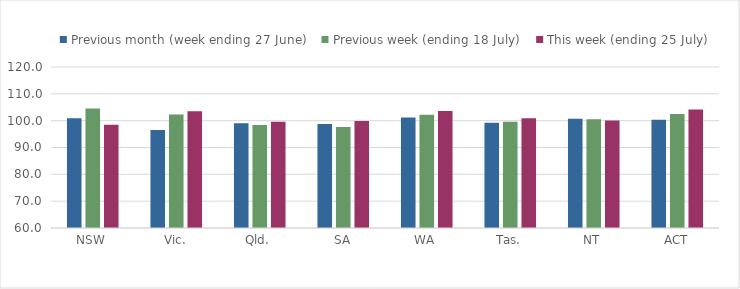
| Category | Previous month (week ending 27 June) | Previous week (ending 18 July) | This week (ending 25 July) |
|---|---|---|---|
| NSW | 100.892 | 104.567 | 98.487 |
| Vic. | 96.547 | 102.31 | 103.543 |
| Qld. | 99.051 | 98.368 | 99.588 |
| SA | 98.765 | 97.684 | 99.848 |
| WA | 101.162 | 102.183 | 103.62 |
| Tas. | 99.196 | 99.598 | 100.872 |
| NT | 100.725 | 100.483 | 100.029 |
| ACT | 100.353 | 102.473 | 104.163 |